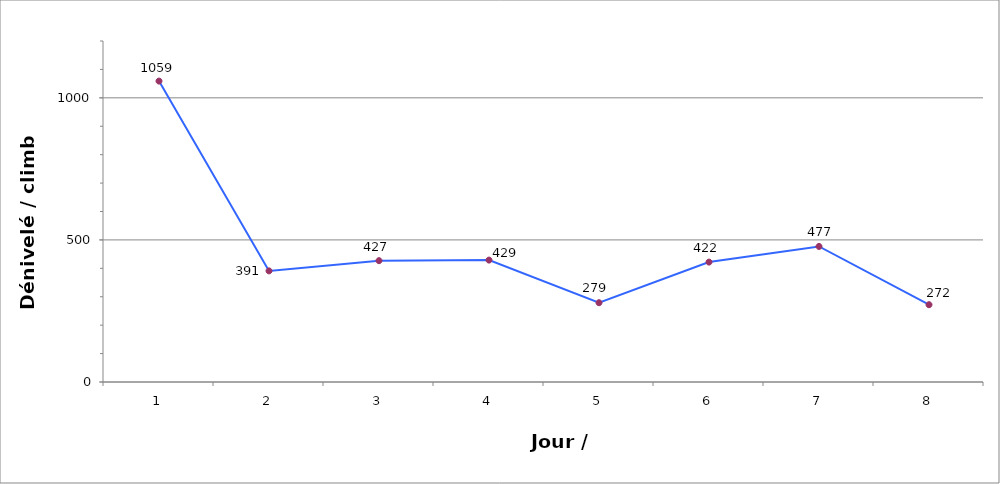
| Category | Series 0 |
|---|---|
| 1.0 | 1059 |
| 2.0 | 391 |
| 3.0 | 427 |
| 4.0 | 429 |
| 5.0 | 279 |
| 6.0 | 422 |
| 7.0 | 477 |
| 8.0 | 272 |